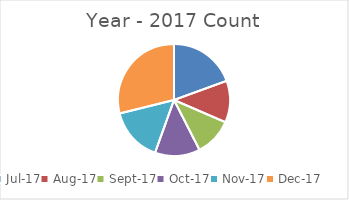
| Category | Year - 2017 |
|---|---|
| 42917.0 | 29449 |
| 42948.0 | 18230 |
| 42979.0 | 16626 |
| 43009.0 | 19695 |
| 43040.0 | 23667 |
| 43070.0 | 43704 |